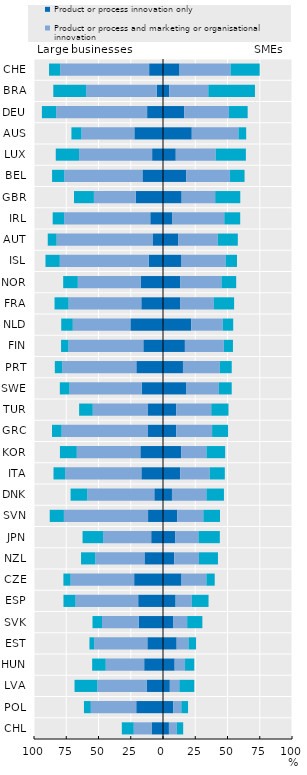
| Category | Product or process innovation only | Product or process and marketing or organisational innovation | Marketing or organisational innovation only |
|---|---|---|---|
| CHL | -8.871 | -13.827 | -9.225 |
| POL | -20.75 | -35.207 | -5.31 |
| LVA | -12.727 | -38.18 | -17.676 |
| HUN | -14.59 | -29.836 | -10.492 |
| EST | -12.15 | -41.121 | -3.738 |
| SVK | -18.873 | -28.431 | -7.353 |
| ESP | -19.229 | -48.573 | -9.35 |
| CZE | -22.36 | -49.298 | -5.546 |
| NZL | -14.365 | -38.122 | -11.05 |
| JPN | -9.149 | -37.326 | -15.893 |
| SVN | -11.585 | -65.244 | -10.976 |
| DNK | -6.747 | -51.938 | -12.954 |
| ITA | -16.784 | -59.051 | -9.051 |
| KOR | -17.578 | -49.258 | -13.071 |
| GRC | -11.628 | -66.977 | -7.442 |
| TUR | -11.611 | -42.864 | -10.547 |
| SWE | -16.45 | -56.026 | -7.492 |
| PRT | -20.679 | -57.442 | -5.744 |
| FIN | -15.259 | -58.038 | -5.722 |
| NLD | -25.316 | -44.62 | -8.966 |
| FRA | -16.829 | -56.368 | -10.884 |
| NOR | -17.105 | -48.947 | -11.316 |
| ISL | -11.111 | -68.889 | -11.111 |
| AUT | -7.741 | -74.746 | -6.853 |
| IRL | -9.868 | -66.776 | -8.882 |
| GBR | -21.196 | -32.37 | -15.438 |
| BEL | -15.951 | -60.554 | -9.487 |
| LUX | -8.434 | -56.627 | -18.072 |
| AUS | -22.222 | -40.972 | -7.793 |
| DEU | -12.318 | -70.455 | -11.106 |
| BRA | -4.754 | -54.766 | -25.528 |
| CHE | -10.748 | -68.848 | -8.745 |